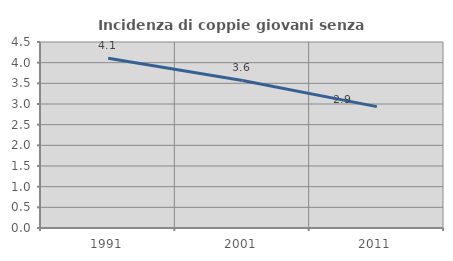
| Category | Incidenza di coppie giovani senza figli |
|---|---|
| 1991.0 | 4.106 |
| 2001.0 | 3.57 |
| 2011.0 | 2.936 |